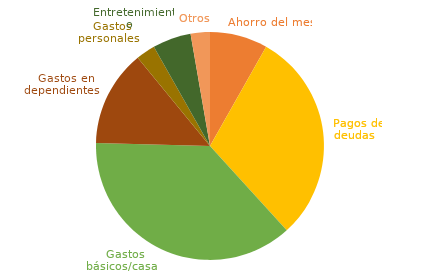
| Category | Series 0 |
|---|---|
|  Ahorro del mes  | 0.082 |
|  Pagos de deudas  | 0.301 |
|  Gastos básicos/casa  | 0.372 |
|  Gastos en dependientes  | 0.137 |
|  Gastos personales  | 0.027 |
|  Entretenimiento  | 0.055 |
|  Otros  | 0.027 |